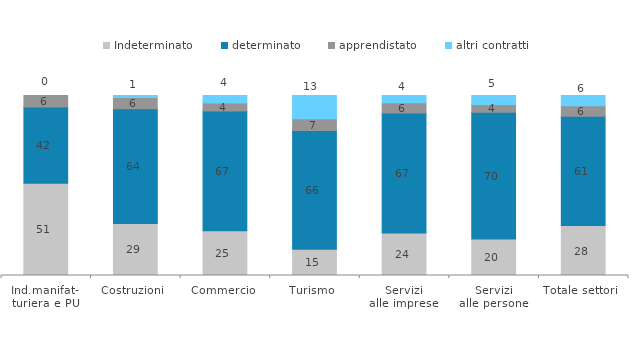
| Category | Indeterminato | determinato | apprendistato | altri contratti |
|---|---|---|---|---|
| Ind.manifat-
turiera e PU | 51.198 | 42.378 | 6.424 | 0 |
| Costruzioni | 28.909 | 63.717 | 6.195 | 1.18 |
| Commercio | 24.907 | 66.501 | 4.483 | 4.11 |
| Turismo | 14.524 | 66.017 | 6.526 | 12.933 |
| Servizi
alle imprese | 23.584 | 66.635 | 5.709 | 4.071 |
| Servizi
alle persone | 20.255 | 70.494 | 4.306 | 4.944 |
| Totale settori | 27.772 | 60.658 | 5.926 | 5.644 |